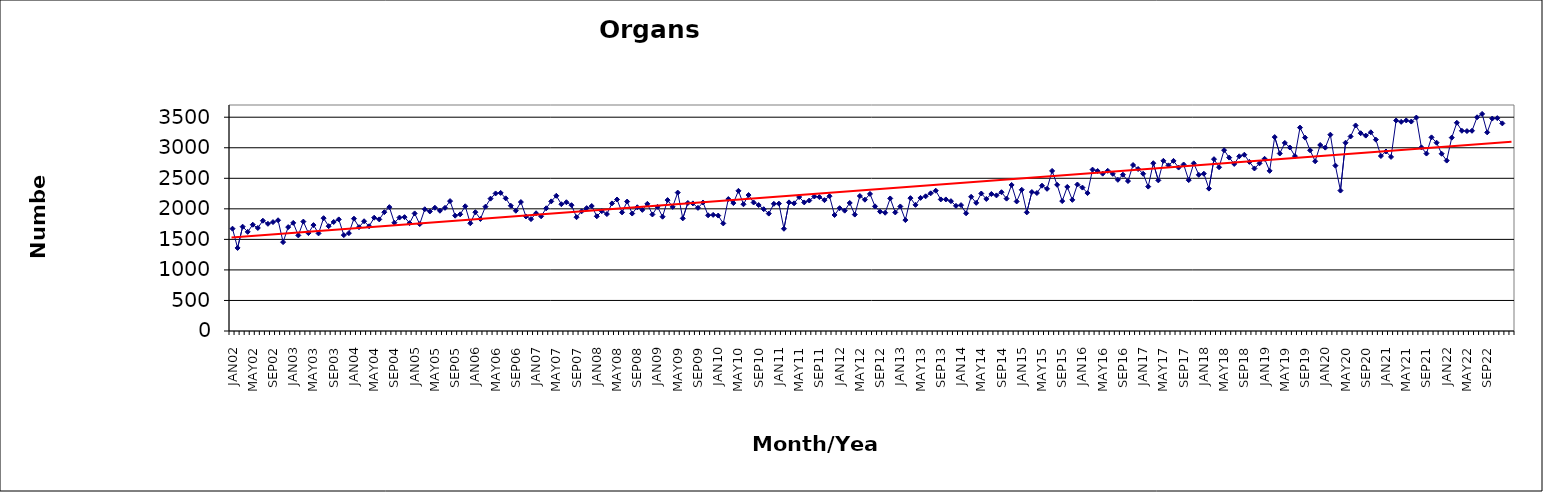
| Category | Series 0 |
|---|---|
| JAN02 | 1675 |
| FEB02 | 1360 |
| MAR02 | 1708 |
| APR02 | 1623 |
| MAY02 | 1740 |
| JUN02 | 1687 |
| JUL02 | 1806 |
| AUG02 | 1755 |
| SEP02 | 1783 |
| OCT02 | 1813 |
| NOV02 | 1455 |
| DEC02 | 1701 |
| JAN03 | 1770 |
| FEB03 | 1565 |
| MAR03 | 1791 |
| APR03 | 1603 |
| MAY03 | 1734 |
| JUN03 | 1598 |
| JUL03 | 1847 |
| AUG03 | 1716 |
| SEP03 | 1785 |
| OCT03 | 1827 |
| NOV03 | 1570 |
| DEC03 | 1602 |
| JAN04 | 1839 |
| FEB04 | 1700 |
| MAR04 | 1797 |
| APR04 | 1715 |
| MAY04 | 1855 |
| JUN04 | 1827 |
| JUL04 | 1945 |
| AUG04 | 2028 |
| SEP04 | 1773 |
| OCT04 | 1857 |
| NOV04 | 1864 |
| DEC04 | 1766 |
| JAN05 | 1925 |
| FEB05 | 1750 |
| MAR05 | 1993 |
| APR05 | 1957 |
| MAY05 | 2018 |
| JUN05 | 1969 |
| JUL05 | 2016 |
| AUG05 | 2127 |
| SEP05 | 1888 |
| OCT05 | 1910 |
| NOV05 | 2042 |
| DEC05 | 1764 |
| JAN06 | 1945 |
| FEB06 | 1834 |
| MAR06 | 2035 |
| APR06 | 2167 |
| MAY06 | 2252 |
| JUN06 | 2261 |
| JUL06 | 2172 |
| AUG06 | 2051 |
| SEP06 | 1969 |
| OCT06 | 2111 |
| NOV06 | 1875 |
| DEC06 | 1832 |
| JAN07 | 1927 |
| FEB07 | 1878 |
| MAR07 | 2009 |
| APR07 | 2122 |
| MAY07 | 2214 |
| JUN07 | 2076 |
| JUL07 | 2108 |
| AUG07 | 2060 |
| SEP07 | 1863 |
| OCT07 | 1959 |
| NOV07 | 2012 |
| DEC07 | 2046 |
| JAN08 | 1878 |
| FEB08 | 1962 |
| MAR08 | 1914 |
| APR08 | 2089 |
| MAY08 | 2153 |
| JUN08 | 1942 |
| JUL08 | 2119 |
| AUG08 | 1923 |
| SEP08 | 2026 |
| OCT08 | 1983 |
| NOV08 | 2082 |
| DEC08 | 1908 |
| JAN09 | 2033 |
| FEB09 | 1871 |
| MAR09 | 2143 |
| APR09 | 2032 |
| MAY09 | 2266 |
| JUN09 | 1844 |
| JUL09 | 2096 |
| AUG09 | 2089 |
| SEP09 | 2016 |
| OCT09 | 2104 |
| NOV09 | 1894 |
| DEC09 | 1901 |
| JAN10 | 1890 |
| FEB10 | 1761 |
| MAR10 | 2160 |
| APR10 | 2094 |
| MAY10 | 2295 |
| JUN10 | 2075 |
| JUL10 | 2226 |
| AUG10 | 2104 |
| SEP10 | 2062 |
| OCT10 | 1994 |
| NOV10 | 1922 |
| DEC10 | 2082 |
| JAN11 | 2085 |
| FEB11 | 1674 |
| MAR11 | 2106 |
| APR11 | 2090 |
| MAY11 | 2194 |
| JUN11 | 2105 |
| JUL11 | 2136 |
| AUG11 | 2202 |
| SEP11 | 2192 |
| OCT11 | 2142 |
| NOV11 | 2207 |
| DEC11 | 1899 |
| JAN12 | 2011 |
| FEB12 | 1970 |
| MAR12 | 2096 |
| APR12 | 1906 |
| MAY12 | 2210 |
| JUN12 | 2150 |
| JUL12 | 2244 |
| AUG12 | 2041 |
| SEP12 | 1954 |
| OCT12 | 1936 |
| NOV12 | 2170 |
| DEC12 | 1941 |
| JAN13 | 2039 |
| FEB13 | 1816 |
| MAR13 | 2175 |
| APR13 | 2065 |
| MAY13 | 2179 |
| JUN13 | 2205 |
| JUL13 | 2254 |
| AUG13 | 2297 |
| SEP13 | 2154 |
| OCT13 | 2154 |
| NOV13 | 2126 |
| DEC13 | 2049 |
| JAN14 | 2061 |
| FEB14 | 1927 |
| MAR14 | 2197 |
| APR14 | 2098 |
| MAY14 | 2251 |
| JUN14 | 2162 |
| JUL14 | 2243 |
| AUG14 | 2220 |
| SEP14 | 2272 |
| OCT14 | 2167 |
| NOV14 | 2391 |
| DEC14 | 2121 |
| JAN15 | 2312 |
| FEB15 | 1942 |
| MAR15 | 2275 |
| APR15 | 2259 |
| MAY15 | 2379 |
| JUN15 | 2328 |
| JUL15 | 2621 |
| AUG15 | 2393 |
| SEP15 | 2127 |
| OCT15 | 2359 |
| NOV15 | 2147 |
| DEC15 | 2398 |
| JAN16 | 2348 |
| FEB16 | 2258 |
| MAR16 | 2642 |
| APR16 | 2619 |
| MAY16 | 2576 |
| JUN16 | 2623 |
| JUL16 | 2573 |
| AUG16 | 2475 |
| SEP16 | 2559 |
| OCT16 | 2455 |
| NOV16 | 2717 |
| DEC16 | 2652 |
| JAN17 | 2574 |
| FEB17 | 2364 |
| MAR17 | 2747 |
| APR17 | 2466 |
| MAY17 | 2786 |
| JUN17 | 2712 |
| JUL17 | 2785 |
| AUG17 | 2676 |
| SEP17 | 2726 |
| OCT17 | 2470 |
| NOV17 | 2745 |
| DEC17 | 2557 |
| JAN18 | 2575 |
| FEB18 | 2331 |
| MAR18 | 2813 |
| APR18 | 2681 |
| MAY18 | 2960 |
| JUN18 | 2839 |
| JUL18 | 2735 |
| AUG18 | 2860 |
| SEP18 | 2886 |
| OCT18 | 2769 |
| NOV18 | 2661 |
| DEC18 | 2745 |
| JAN19 | 2819 |
| FEB19 | 2622 |
| MAR19 | 3175 |
| APR19 | 2906 |
| MAY19 | 3079 |
| JUN19 | 3004 |
| JUL19 | 2863 |
| AUG19 | 3330 |
| SEP19 | 3166 |
| OCT19 | 2958 |
| NOV19 | 2779 |
| DEC19 | 3045 |
| JAN20 | 3002 |
| FEB20 | 3214 |
| MAR20 | 2707 |
| APR20 | 2299 |
| MAY20 | 3082 |
| JUN20 | 3185 |
| JUL20 | 3365 |
| AUG20 | 3238 |
| SEP20 | 3199 |
| OCT20 | 3253 |
| NOV20 | 3133 |
| DEC20 | 2865 |
| JAN21 | 2939 |
| FEB21 | 2850 |
| MAR21 | 3446 |
| APR21 | 3424 |
| MAY21 | 3447 |
| JUN21 | 3429 |
| JUL21 | 3494 |
| AUG21 | 3006 |
| SEP21 | 2905 |
| OCT21 | 3170 |
| NOV21 | 3083 |
| DEC21 | 2902 |
| JAN22 | 2790 |
| FEB22 | 3166 |
| MAR22 | 3409 |
| APR22 | 3278 |
| MAY22 | 3273 |
| JUN22 | 3278 |
| JUL22 | 3499 |
| AUG22 | 3554 |
| SEP22 | 3252 |
| OCT22 | 3478 |
| NOV22 | 3485 |
| DEC22 | 3399 |